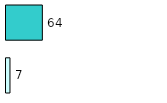
| Category | Series 0 | Series 1 |
|---|---|---|
| 0 | 7 | 64 |